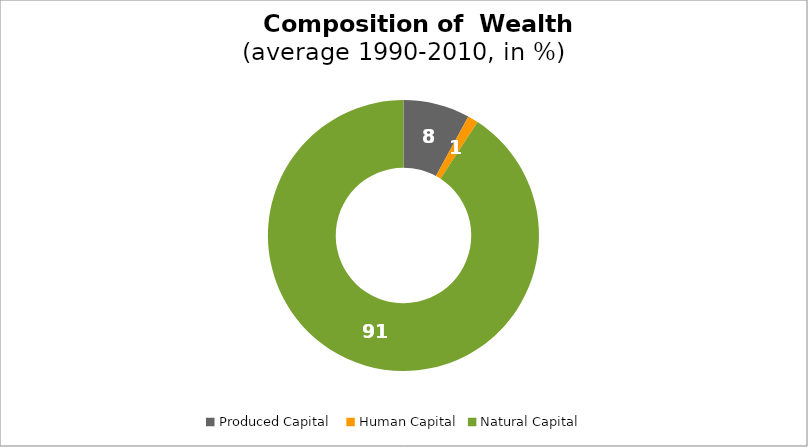
| Category | Series 0 |
|---|---|
| Produced Capital  | 7.945 |
| Human Capital | 1.268 |
| Natural Capital | 90.787 |